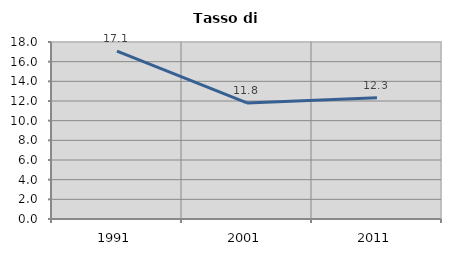
| Category | Tasso di disoccupazione   |
|---|---|
| 1991.0 | 17.075 |
| 2001.0 | 11.8 |
| 2011.0 | 12.34 |